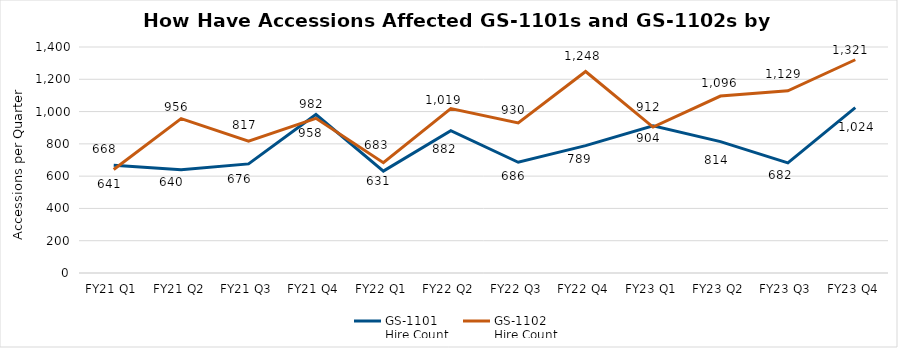
| Category | GS-1101 
Hire Count | GS-1102 
Hire Count |
|---|---|---|
| FY21 Q1 | 668 | 641 |
| FY21 Q2 | 640 | 956 |
| FY21 Q3 | 676 | 817 |
| FY21 Q4 | 982 | 958 |
| FY22 Q1 | 631 | 683 |
| FY22 Q2 | 882 | 1019 |
| FY22 Q3 | 686 | 930 |
| FY22 Q4 | 789 | 1248 |
| FY23 Q1 | 912 | 904 |
| FY23 Q2 | 814 | 1096 |
| FY23 Q3 | 682 | 1129 |
| FY23 Q4 | 1024 | 1321 |